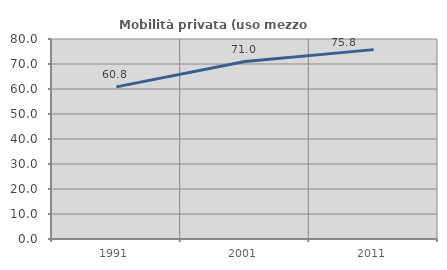
| Category | Mobilità privata (uso mezzo privato) |
|---|---|
| 1991.0 | 60.843 |
| 2001.0 | 71 |
| 2011.0 | 75.751 |